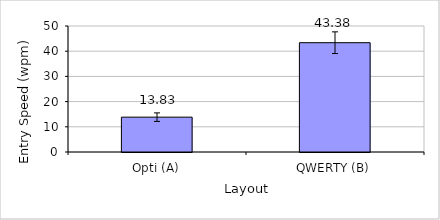
| Category | Series 0 |
|---|---|
| Opti (A) | 13.829 |
| QWERTY (B) | 43.375 |